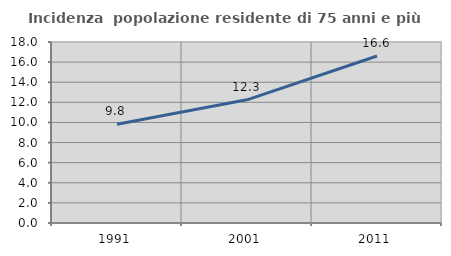
| Category | Incidenza  popolazione residente di 75 anni e più |
|---|---|
| 1991.0 | 9.818 |
| 2001.0 | 12.252 |
| 2011.0 | 16.606 |